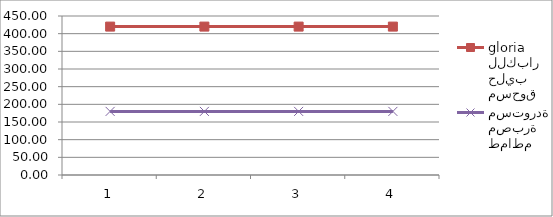
| Category | مسحوق حليب للكبار gloria | طماطم مصبرة مستوردة  |
|---|---|---|
| 0 | 420 | 180 |
| 1 | 420 | 180 |
| 2 | 420 | 180 |
| 3 | 420 | 180 |